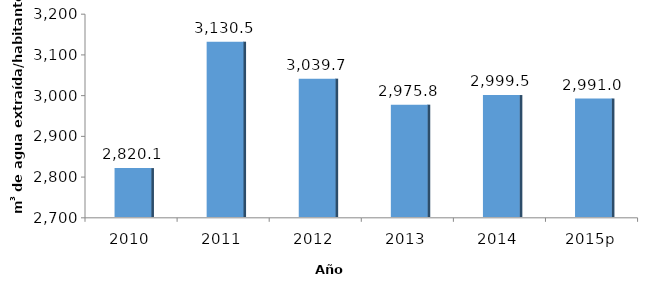
| Category | Intensidad de uso (directo) del agua (m3/habitante) |
|---|---|
| 2010 | 2820.068 |
| 2011 | 3130.486 |
| 2012 | 3039.726 |
| 2013 | 2975.827 |
| 2014 | 2999.466 |
| 2015p | 2990.965 |